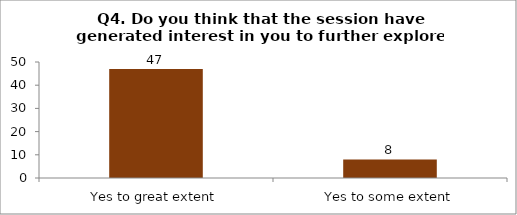
| Category | Q4. Do you think that the session have generated interest in you to further explore the topics? |
|---|---|
| Yes to great extent | 47 |
| Yes to some extent | 8 |